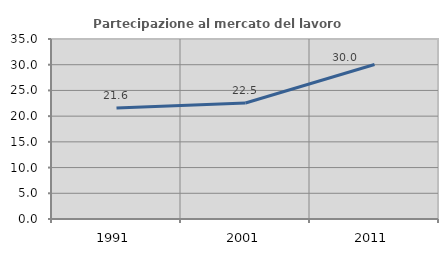
| Category | Partecipazione al mercato del lavoro  femminile |
|---|---|
| 1991.0 | 21.583 |
| 2001.0 | 22.549 |
| 2011.0 | 30.035 |